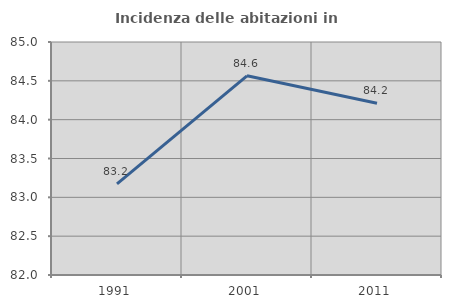
| Category | Incidenza delle abitazioni in proprietà  |
|---|---|
| 1991.0 | 83.172 |
| 2001.0 | 84.565 |
| 2011.0 | 84.211 |